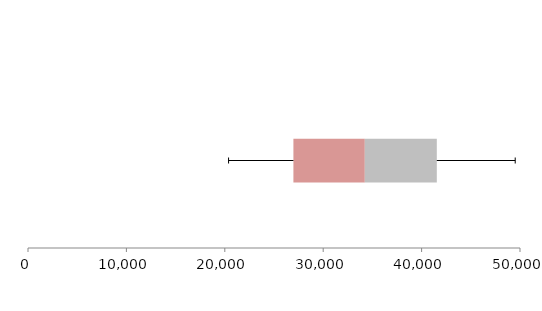
| Category | Series 1 | Series 2 | Series 3 |
|---|---|---|---|
| 0 | 26972.904 | 7257.18 | 7315.3 |